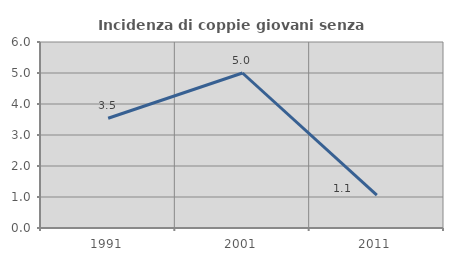
| Category | Incidenza di coppie giovani senza figli |
|---|---|
| 1991.0 | 3.54 |
| 2001.0 | 5 |
| 2011.0 | 1.064 |